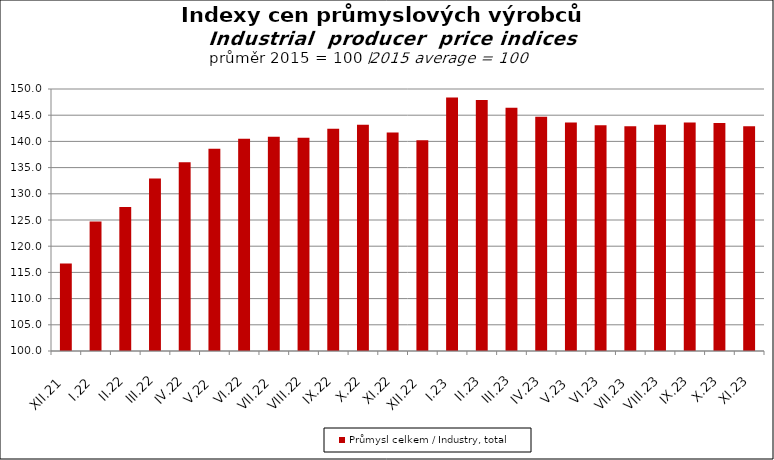
| Category | Průmysl celkem / Industry, total |
|---|---|
| XII.21 | 116.7 |
| I.22 | 124.7 |
| II.22 | 127.5 |
| III.22 | 132.9 |
| IV.22 | 136 |
| V.22 | 138.6 |
| VI.22 | 140.5 |
| VII.22 | 140.9 |
| VIII.22 | 140.7 |
| IX.22 | 142.4 |
| X.22 | 143.2 |
| XI.22 | 141.7 |
| XII.22 | 140.2 |
| I.23 | 148.4 |
| II.23 | 147.9 |
| III.23 | 146.4 |
| IV.23 | 144.7 |
| V.23 | 143.6 |
| VI.23 | 143.1 |
| VII.23 | 142.9 |
| VIII.23 | 143.2 |
| IX.23 | 143.6 |
| X.23 | 143.5 |
| XI.23 | 142.9 |